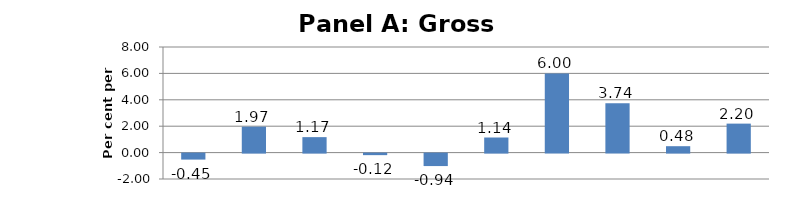
| Category | Series 0 |
|---|---|
| Paper manufacturing | -0.453 |
| Crop and animal production | 1.965 |
| Wood product manufacturing | 1.172 |
| Forestry and logging | -0.117 |
| Fishing, hunting and trapping | -0.945 |
| Petroleum and coal products manufacturing | 1.144 |
| Support activities for mining and oil and gas | 5.996 |
| Oil and gas extraction | 3.743 |
| Mining (except oil and gas) | 0.485 |
| Support activities for agriculture and forestry | 2.195 |